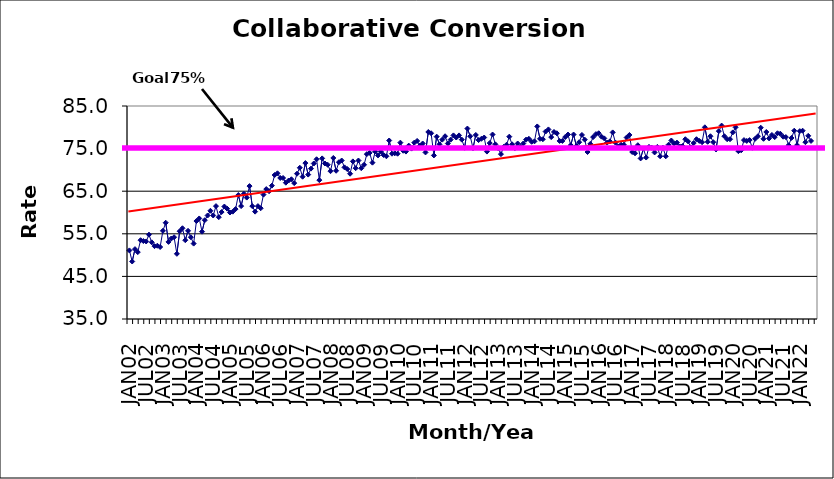
| Category | Series 0 |
|---|---|
| JAN02 | 51.1 |
| FEB02 | 48.5 |
| MAR02 | 51.4 |
| APR02 | 50.7 |
| MAY02 | 53.5 |
| JUN02 | 53.3 |
| JUL02 | 53.2 |
| AUG02 | 54.8 |
| SEP02 | 53 |
| OCT02 | 52.1 |
| NOV02 | 52.2 |
| DEC02 | 51.9 |
| JAN03 | 55.7 |
| FEB03 | 57.6 |
| MAR03 | 53.1 |
| APR03 | 53.9 |
| MAY03 | 54.2 |
| JUN03 | 50.3 |
| JUL03 | 55.6 |
| AUG03 | 56.3 |
| SEP03 | 53.5 |
| OCT03 | 55.7 |
| NOV03 | 54.2 |
| DEC03 | 52.7 |
| JAN04 | 58 |
| FEB04 | 58.6 |
| MAR04 | 55.5 |
| APR04 | 58.2 |
| MAY04 | 59.3 |
| JUN04 | 60.4 |
| JUL04 | 59.3 |
| AUG04 | 61.5 |
| SEP04 | 58.9 |
| OCT04 | 60.1 |
| NOV04 | 61.4 |
| DEC04 | 60.9 |
| JAN05 | 60 |
| FEB05 | 60.2 |
| MAR05 | 60.8 |
| APR05 | 64.1 |
| MAY05 | 61.5 |
| JUN05 | 64.4 |
| JUL05 | 63.5 |
| AUG05 | 66.2 |
| SEP05 | 61.5 |
| OCT05 | 60.2 |
| NOV05 | 61.5 |
| DEC05 | 61 |
| JAN06 | 64.2 |
| FEB06 | 65.5 |
| MAR06 | 65 |
| APR06 | 66.3 |
| MAY06 | 68.8 |
| JUN06 | 69.2 |
| JUL06 | 68.1 |
| AUG06 | 68.1 |
| SEP06 | 67 |
| OCT06 | 67.5 |
| NOV06 | 67.8 |
| DEC06 | 66.9 |
| JAN07 | 69.1 |
| FEB07 | 70.5 |
| MAR07 | 68.4 |
| APR07 | 71.6 |
| MAY07 | 68.9 |
| JUN07 | 70.3 |
| JUL07 | 71.5 |
| AUG07 | 72.5 |
| SEP07 | 67.6 |
| OCT07 | 72.7 |
| NOV07 | 71.5 |
| DEC07 | 71.2 |
| JAN08 | 69.7 |
| FEB08 | 72.8 |
| MAR08 | 69.8 |
| APR08 | 71.8 |
| MAY08 | 72.2 |
| JUN08 | 70.6 |
| JUL08 | 70.2 |
| AUG08 | 69.1 |
| SEP08 | 72 |
| OCT08 | 70.4 |
| NOV08 | 72.2 |
| DEC08 | 70.4 |
| JAN09 | 71.2 |
| FEB09 | 73.7 |
| MAR09 | 74 |
| APR09 | 71.7 |
| MAY09 | 74.3 |
| JUN09 | 73.4 |
| JUL09 | 74.3 |
| AUG09 | 73.5 |
| SEP09 | 73.2 |
| OCT09 | 76.9 |
| NOV09 | 73.8 |
| DEC09 | 73.9 |
| JAN10 | 73.8 |
| FEB10 | 76.4 |
| MAR10 | 74.5 |
| APR10 | 74.3 |
| MAY10 | 75.7 |
| JUN10 | 75 |
| JUL10 | 76.4 |
| AUG10 | 76.8 |
| SEP10 | 75.7 |
| OCT10 | 76.2 |
| NOV10 | 74.1 |
| DEC10 | 78.9 |
| JAN11 | 78.6 |
| FEB11 | 73.4 |
| MAR11 | 77.8 |
| APR11 | 76 |
| MAY11 | 77.1 |
| JUN11 | 77.9 |
| JUL11 | 76.2 |
| AUG11 | 77.1 |
| SEP11 | 78.1 |
| OCT11 | 77.6 |
| NOV11 | 78.1 |
| DEC11 | 77.1 |
| JAN12 | 75.2 |
| FEB12 | 79.7 |
| MAR12 | 77.9 |
| APR12 | 75.1 |
| MAY12 | 78.2 |
| JUN12 | 77 |
| JUL12 | 77.3 |
| AUG12 | 77.6 |
| SEP12 | 74.3 |
| OCT12 | 76.3 |
| NOV12 | 78.3 |
| DEC12 | 76 |
| JAN13 | 75.1 |
| FEB13 | 73.7 |
| MAR13 | 75.4 |
| APR13 | 75.9 |
| MAY13 | 77.8 |
| JUN13 | 76 |
| JUL13 | 75.1 |
| AUG13 | 76.2 |
| SEP13 | 75.4 |
| OCT13 | 76.2 |
| NOV13 | 77.1 |
| DEC13 | 77.3 |
| JAN14 | 76.6 |
| FEB14 | 76.7 |
| MAR14 | 80.2 |
| APR14 | 77.3 |
| MAY14 | 77.2 |
| JUN14 | 79 |
| JUL14 | 79.5 |
| AUG14 | 77.7 |
| SEP14 | 78.9 |
| OCT14 | 78.6 |
| NOV14 | 76.8 |
| DEC14 | 76.8 |
| JAN15 | 77.7 |
| FEB15 | 78.3 |
| MAR15 | 75.8 |
| APR15 | 78.3 |
| MAY15 | 75.6 |
| JUN15 | 76.5 |
| JUL15 | 78.2 |
| AUG15 | 77.1 |
| SEP15 | 74.2 |
| OCT15 | 76.1 |
| NOV15 | 77.7 |
| DEC15 | 78.4 |
| JAN16 | 78.6 |
| FEB16 | 77.8 |
| MAR16 | 77.4 |
| APR16 | 76.4 |
| MAY16 | 76.7 |
| JUN16 | 78.8 |
| JUL16 | 76.4 |
| AUG16 | 75.5 |
| SEP16 | 75.9 |
| OCT16 | 75.9 |
| NOV16 | 77.6 |
| DEC16 | 78.2 |
| JAN17 | 74.2 |
| FEB17 | 73.9 |
| MAR17 | 75.8 |
| APR17 | 72.7 |
| MAY17 | 75 |
| JUN17 | 72.9 |
| JUL17 | 75.4 |
| AUG17 | 75.2 |
| SEP17 | 74.1 |
| OCT17 | 75.4 |
| NOV17 | 73.2 |
| DEC17 | 75.2 |
| JAN18 | 73.2 |
| FEB18 | 75.9 |
| MAR18 | 76.9 |
| APR18 | 76.2 |
| MAY18 | 76.4 |
| JUN18 | 75.5 |
| JUL18 | 75.6 |
| AUG18 | 77.2 |
| SEP18 | 76.7 |
| OCT18 | 75.3 |
| NOV18 | 76.3 |
| DEC18 | 77.2 |
| JAN19 | 76.8 |
| FEB19 | 76.5 |
| MAR19 | 80 |
| APR19 | 76.6 |
| MAY19 | 77.9 |
| JUN19 | 76.5 |
| JUL19 | 74.8 |
| AUG19 | 79.1 |
| SEP19 | 80.4 |
| OCT19 | 77.9 |
| NOV19 | 77.2 |
| DEC19 | 77.2 |
| JAN20 | 78.8 |
| FEB20 | 80 |
| MAR20 | 74.4 |
| APR20 | 74.6 |
| MAY20 | 77 |
| JUN20 | 76.8 |
| JUL20 | 77 |
| AUG20 | 75.2 |
| SEP20 | 77.3 |
| OCT20 | 77.9 |
| NOV20 | 79.9 |
| DEC20 | 77.3 |
| JAN21 | 78.9 |
| FEB21 | 77.4 |
| MAR21 | 78.2 |
| APR21 | 77.7 |
| MAY21 | 78.6 |
| JUN21 | 78.5 |
| JUL21 | 77.8 |
| AUG21 | 77.7 |
| SEP21 | 75.8 |
| OCT21 | 77.5 |
| NOV21 | 79.2 |
| DEC21 | 75.8 |
| JAN22 | 79.1 |
| FEB22 | 79.2 |
| MAR22 | 76.5 |
| APR22 | 78 |
| MAY22 | 76.8 |